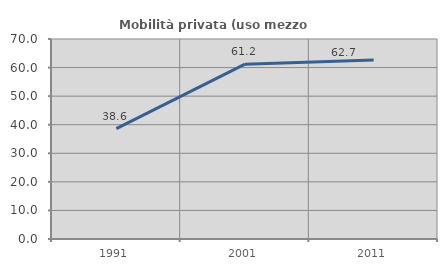
| Category | Mobilità privata (uso mezzo privato) |
|---|---|
| 1991.0 | 38.636 |
| 2001.0 | 61.194 |
| 2011.0 | 62.687 |